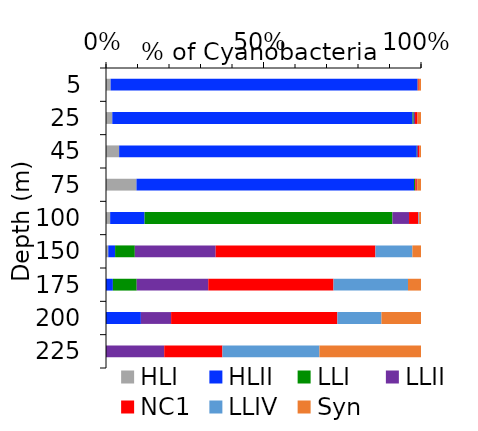
| Category | HLI | HLII | LLI | LLII | NC1 | LLIV | Syn |
|---|---|---|---|---|---|---|---|
| 5.0 | 0.015 | 0.973 | 0.001 | 0.002 | 0.002 | 0 | 0.007 |
| 25.0 | 0.02 | 0.953 | 0.004 | 0.004 | 0.008 | 0 | 0.011 |
| 45.0 | 0.042 | 0.945 | 0.001 | 0.003 | 0.005 | 0 | 0.005 |
| 75.0 | 0.097 | 0.881 | 0.004 | 0.001 | 0.005 | 0.001 | 0.012 |
| 100.0 | 0.013 | 0.109 | 0.787 | 0.053 | 0.03 | 0.002 | 0.006 |
| 150.0 | 0.007 | 0.022 | 0.063 | 0.257 | 0.507 | 0.117 | 0.027 |
| 175.0 | 0 | 0.022 | 0.076 | 0.227 | 0.397 | 0.237 | 0.041 |
| 200.0 | 0 | 0.111 | 0 | 0.096 | 0.528 | 0.14 | 0.126 |
| 225.0 | 0 | 0 | 0 | 0.185 | 0.185 | 0.308 | 0.322 |